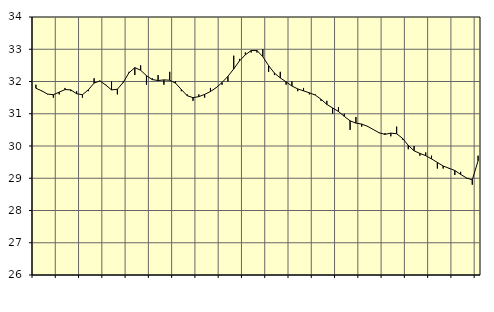
| Category | Piggar | Series 1 |
|---|---|---|
| nan | 31.9 | 31.79 |
| 1.0 | 31.7 | 31.71 |
| 1.0 | 31.6 | 31.61 |
| 1.0 | 31.5 | 31.59 |
| nan | 31.6 | 31.67 |
| 2.0 | 31.8 | 31.75 |
| 2.0 | 31.7 | 31.74 |
| 2.0 | 31.7 | 31.62 |
| nan | 31.5 | 31.59 |
| 3.0 | 31.7 | 31.74 |
| 3.0 | 32.1 | 31.95 |
| 3.0 | 32 | 32.02 |
| nan | 31.9 | 31.89 |
| 4.0 | 32 | 31.74 |
| 4.0 | 31.6 | 31.76 |
| 4.0 | 32 | 31.97 |
| nan | 32.3 | 32.27 |
| 5.0 | 32.2 | 32.43 |
| 5.0 | 32.5 | 32.35 |
| 5.0 | 31.9 | 32.18 |
| nan | 32.1 | 32.06 |
| 6.0 | 32.2 | 32.03 |
| 6.0 | 31.9 | 32.05 |
| 6.0 | 32.3 | 32.04 |
| nan | 32 | 31.95 |
| 7.0 | 31.7 | 31.75 |
| 7.0 | 31.6 | 31.56 |
| 7.0 | 31.4 | 31.5 |
| nan | 31.6 | 31.53 |
| 8.0 | 31.5 | 31.6 |
| 8.0 | 31.8 | 31.69 |
| 8.0 | 31.8 | 31.81 |
| nan | 31.9 | 31.97 |
| 9.0 | 32 | 32.16 |
| 9.0 | 32.8 | 32.39 |
| 9.0 | 32.7 | 32.64 |
| nan | 32.9 | 32.83 |
| 10.0 | 32.9 | 32.96 |
| 10.0 | 32.9 | 32.96 |
| 10.0 | 33 | 32.77 |
| nan | 32.3 | 32.49 |
| 11.0 | 32.2 | 32.26 |
| 11.0 | 32.3 | 32.11 |
| 11.0 | 31.9 | 31.99 |
| nan | 32 | 31.86 |
| 12.0 | 31.7 | 31.77 |
| 12.0 | 31.8 | 31.71 |
| 12.0 | 31.6 | 31.65 |
| nan | 31.6 | 31.58 |
| 13.0 | 31.4 | 31.45 |
| 13.0 | 31.4 | 31.29 |
| 13.0 | 31 | 31.18 |
| nan | 31.2 | 31.07 |
| 14.0 | 31 | 30.92 |
| 14.0 | 30.5 | 30.78 |
| 14.0 | 30.9 | 30.71 |
| nan | 30.6 | 30.68 |
| 15.0 | 30.6 | 30.61 |
| 15.0 | 30.5 | 30.51 |
| 15.0 | 30.4 | 30.41 |
| nan | 30.4 | 30.36 |
| 16.0 | 30.3 | 30.4 |
| 16.0 | 30.6 | 30.38 |
| 16.0 | 30.2 | 30.24 |
| nan | 29.9 | 30.02 |
| 17.0 | 30 | 29.85 |
| 17.0 | 29.7 | 29.77 |
| 17.0 | 29.8 | 29.7 |
| nan | 29.7 | 29.6 |
| 18.0 | 29.3 | 29.49 |
| 18.0 | 29.3 | 29.38 |
| 18.0 | 29.3 | 29.31 |
| nan | 29.1 | 29.24 |
| 19.0 | 29.2 | 29.12 |
| 19.0 | 29 | 29.01 |
| 19.0 | 28.8 | 28.95 |
| nan | 29.7 | 29.54 |